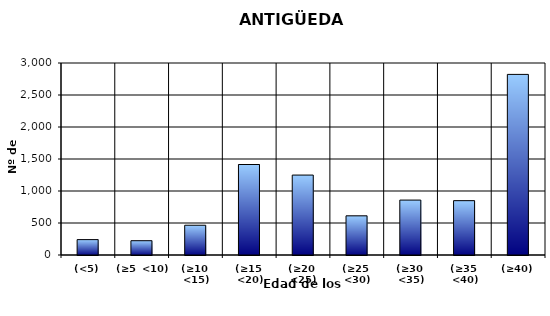
| Category | (<5) |
|---|---|
| (<5) | 240 |
| (≥5  <10) | 223 |
| (≥10  <15) | 465 |
| (≥15  <20) | 1414 |
| (≥20  <25) | 1249 |
| (≥25  <30) | 612 |
| (≥30  <35) | 858 |
| (≥35  <40) | 849 |
| (≥40) | 2822 |